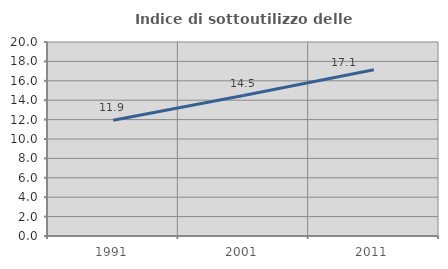
| Category | Indice di sottoutilizzo delle abitazioni  |
|---|---|
| 1991.0 | 11.926 |
| 2001.0 | 14.484 |
| 2011.0 | 17.147 |